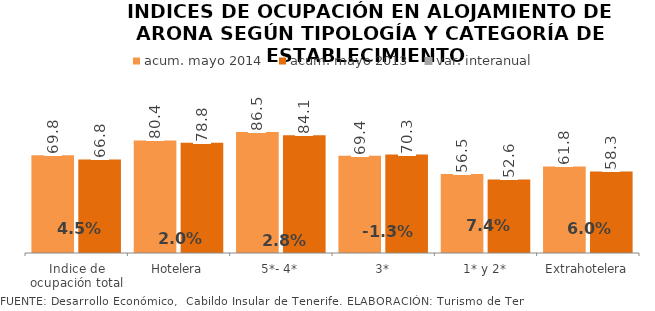
| Category | acum. mayo 2014 | acum. mayo 2013 |
|---|---|---|
| Indice de ocupación total | 69.787 | 66.793 |
| Hotelera | 80.377 | 78.832 |
| 5*- 4* | 86.467 | 84.116 |
| 3* | 69.419 | 70.314 |
| 1* y 2* | 56.491 | 52.583 |
| Extrahotelera | 61.828 | 58.301 |